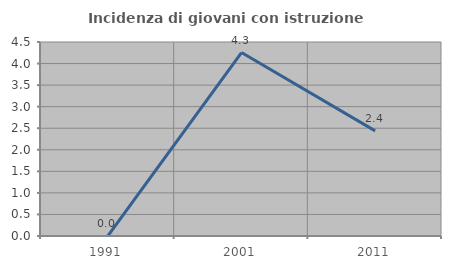
| Category | Incidenza di giovani con istruzione universitaria |
|---|---|
| 1991.0 | 0 |
| 2001.0 | 4.255 |
| 2011.0 | 2.439 |